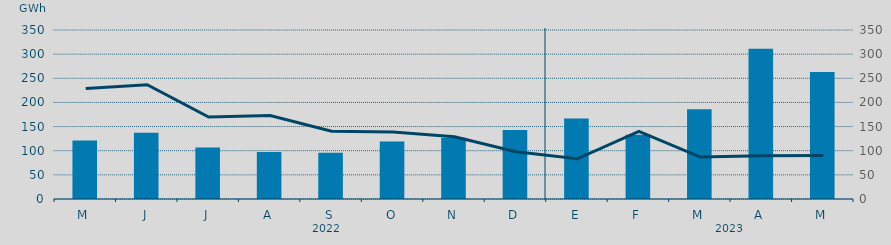
| Category | Energía a subir |
|---|---|
| M | 120.911 |
| J | 137.249 |
| J | 106.554 |
| A | 97.587 |
| S | 95.748 |
| O | 118.914 |
| N | 126.653 |
| D | 143.004 |
| E | 166.862 |
| F | 132.923 |
| M | 185.844 |
| A | 310.964 |
| M | 263.086 |